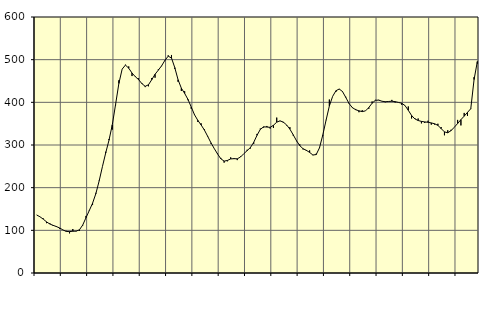
| Category | Piggar | Series 1 |
|---|---|---|
| nan | 136.1 | 135.94 |
| 87.0 | 131.9 | 131.87 |
| 87.0 | 127.9 | 126.28 |
| 87.0 | 116.8 | 119.91 |
| nan | 116.7 | 114.82 |
| 88.0 | 110.3 | 111.72 |
| 88.0 | 110.1 | 108.84 |
| 88.0 | 103.7 | 105.51 |
| nan | 101 | 100.97 |
| 89.0 | 98.9 | 97.38 |
| 89.0 | 92.9 | 96.98 |
| 89.0 | 103.1 | 97.82 |
| nan | 97.5 | 98.11 |
| 90.0 | 98.5 | 101.14 |
| 90.0 | 111.1 | 112.34 |
| 90.0 | 133.8 | 129.44 |
| nan | 147.4 | 146.35 |
| 91.0 | 159.2 | 163.51 |
| 91.0 | 187.8 | 185.89 |
| 91.0 | 216.3 | 215.57 |
| nan | 249.6 | 249.4 |
| 92.0 | 284.1 | 281.43 |
| 92.0 | 314 | 311.37 |
| 92.0 | 336.1 | 347.24 |
| nan | 393 | 394.89 |
| 93.0 | 451.7 | 444.25 |
| 93.0 | 477.9 | 477.86 |
| 93.0 | 488.2 | 487.33 |
| nan | 484.1 | 480.06 |
| 94.0 | 461.6 | 468.66 |
| 94.0 | 461 | 460.13 |
| 94.0 | 456.4 | 453.19 |
| nan | 445.2 | 443.91 |
| 95.0 | 435.7 | 437.53 |
| 95.0 | 437.6 | 441.12 |
| 95.0 | 457 | 453.09 |
| nan | 457.7 | 465.75 |
| 96.0 | 477.5 | 475.47 |
| 96.0 | 484.8 | 485.62 |
| 96.0 | 497.3 | 498.37 |
| nan | 510.1 | 508.2 |
| 97.0 | 511 | 503.9 |
| 97.0 | 478.4 | 481.43 |
| 97.0 | 448.1 | 452.93 |
| nan | 426.6 | 433.16 |
| 98.0 | 426 | 420.98 |
| 98.0 | 405 | 407.01 |
| 98.0 | 384.9 | 389.13 |
| nan | 372.1 | 370.88 |
| 99.0 | 354.1 | 357.81 |
| 99.0 | 350.8 | 347.02 |
| 99.0 | 336.7 | 335.11 |
| nan | 319.5 | 320.44 |
| 0.0 | 303 | 305.16 |
| 0.0 | 291.4 | 291.72 |
| 0.0 | 280.2 | 279.05 |
| nan | 269.7 | 267.75 |
| 1.0 | 258.7 | 262.21 |
| 1.0 | 261.8 | 263.77 |
| 1.0 | 271 | 267.39 |
| nan | 269.2 | 267.92 |
| 2.0 | 264.6 | 267.63 |
| 2.0 | 272.9 | 271.91 |
| 2.0 | 279.9 | 279.7 |
| nan | 288.9 | 286.79 |
| 3.0 | 291.8 | 294.08 |
| 3.0 | 302.7 | 306.22 |
| 3.0 | 326 | 322.69 |
| nan | 338.5 | 336.52 |
| 4.0 | 340.8 | 342.62 |
| 4.0 | 344.6 | 342.11 |
| 4.0 | 338.5 | 341.41 |
| nan | 340.1 | 346.24 |
| 5.0 | 364.2 | 353.54 |
| 5.0 | 356.1 | 356.57 |
| 5.0 | 352.3 | 353.71 |
| nan | 346.1 | 347.05 |
| 6.0 | 341.8 | 337.18 |
| 6.0 | 322.2 | 324.04 |
| 6.0 | 309 | 310.2 |
| nan | 301.6 | 298.57 |
| 7.0 | 289.6 | 291.31 |
| 7.0 | 286 | 287.56 |
| 7.0 | 287.3 | 282.61 |
| nan | 276.1 | 276.56 |
| 8.0 | 279.6 | 277.56 |
| 8.0 | 294.6 | 293.38 |
| 8.0 | 321.8 | 323.25 |
| nan | 358.8 | 358.15 |
| 9.0 | 406.6 | 391.38 |
| 9.0 | 414 | 414.07 |
| 9.0 | 424.4 | 427.14 |
| nan | 430.5 | 431.27 |
| 10.0 | 426.2 | 425.28 |
| 10.0 | 412.9 | 411.47 |
| 10.0 | 396.1 | 397.08 |
| nan | 386.6 | 387.58 |
| 11.0 | 384.5 | 382.69 |
| 11.0 | 376.8 | 380.12 |
| 11.0 | 381.6 | 378.28 |
| nan | 380 | 380.02 |
| 12.0 | 384.9 | 387.85 |
| 12.0 | 402 | 398 |
| 12.0 | 405.7 | 404.79 |
| nan | 405.7 | 405.18 |
| 13.0 | 402.7 | 402.56 |
| 13.0 | 400.2 | 401.43 |
| 13.0 | 401.5 | 402.01 |
| nan | 405.7 | 402.56 |
| 14.0 | 399.6 | 401.64 |
| 14.0 | 399.5 | 399.79 |
| 14.0 | 394.2 | 397.96 |
| nan | 392.8 | 392.38 |
| 15.0 | 390.3 | 381.4 |
| 15.0 | 362.2 | 369.23 |
| 15.0 | 362.7 | 361.15 |
| nan | 362.1 | 357.42 |
| 16.0 | 350.7 | 355.32 |
| 16.0 | 351.6 | 354.07 |
| 16.0 | 356.9 | 353.26 |
| nan | 347.7 | 351.75 |
| 17.0 | 347.8 | 349.81 |
| 17.0 | 349.8 | 345.99 |
| 17.0 | 341.9 | 338.44 |
| nan | 322.8 | 330.71 |
| 18.0 | 334.6 | 328.69 |
| 18.0 | 335.7 | 333.64 |
| 18.0 | 341.7 | 341.68 |
| nan | 358.8 | 350.37 |
| 19.0 | 345.9 | 359.42 |
| 19.0 | 375.2 | 367.65 |
| 19.0 | 368.1 | 376.5 |
| nan | 384.2 | 385.02 |
| 20.0 | 459.1 | 453.44 |
| 20.0 | 490.6 | 495.66 |